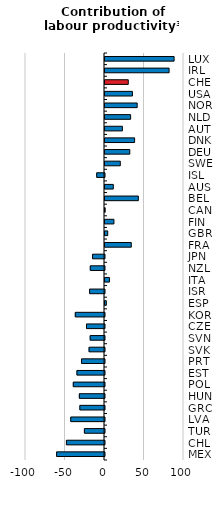
| Category | Contribution of labour productivity³ |
|---|---|
| MEX | -60.599 |
| CHL | -48.181 |
| TUR | -25.437 |
| LVA | -42.726 |
| GRC | -31.141 |
| HUN | -31.834 |
| POL | -39.489 |
| EST | -34.864 |
| PRT | -29.038 |
| SVK | -19.521 |
| SVN | -18.1 |
| CZE | -22.799 |
| KOR | -36.955 |
| ESP | 1.673 |
| ISR | -18.841 |
| ITA | 5.649 |
| NZL | -17.984 |
| JPN | -15.105 |
| FRA | 33.278 |
| GBR | 3.47 |
| FIN | 11.314 |
| CAN | 0.227 |
| BEL | 42.212 |
| AUS | 10.507 |
| ISL | -9.866 |
| SWE | 19.353 |
| DEU | 31.351 |
| DNK | 37.473 |
| AUT | 22.016 |
| NLD | 32.43 |
| NOR | 40.724 |
| USA | 34.727 |
| CHE | 29.456 |
| IRL | 81.142 |
| LUX | 87.471 |